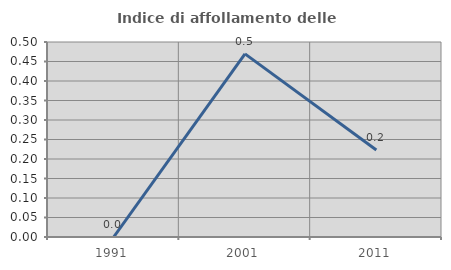
| Category | Indice di affollamento delle abitazioni  |
|---|---|
| 1991.0 | 0 |
| 2001.0 | 0.469 |
| 2011.0 | 0.223 |